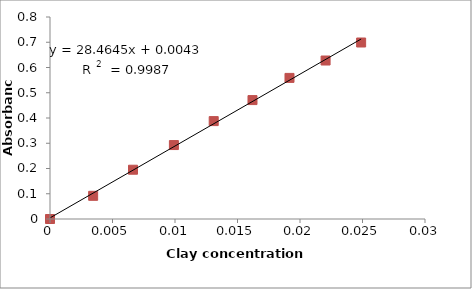
| Category | Series 1 |
|---|---|
| 0.0 | 0 |
| 0.0034516765285996 | 0.092 |
| 0.00664024475038242 | 0.195 |
| 0.00991219646041981 | 0.293 |
| 0.0130973331528361 | 0.388 |
| 0.0161990647962592 | 0.471 |
| 0.0191597414589104 | 0.559 |
| 0.0220463722808389 | 0.628 |
| 0.0248906611782866 | 0.699 |